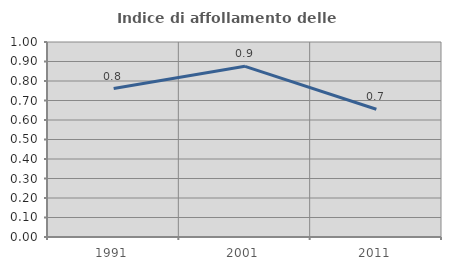
| Category | Indice di affollamento delle abitazioni  |
|---|---|
| 1991.0 | 0.761 |
| 2001.0 | 0.875 |
| 2011.0 | 0.655 |